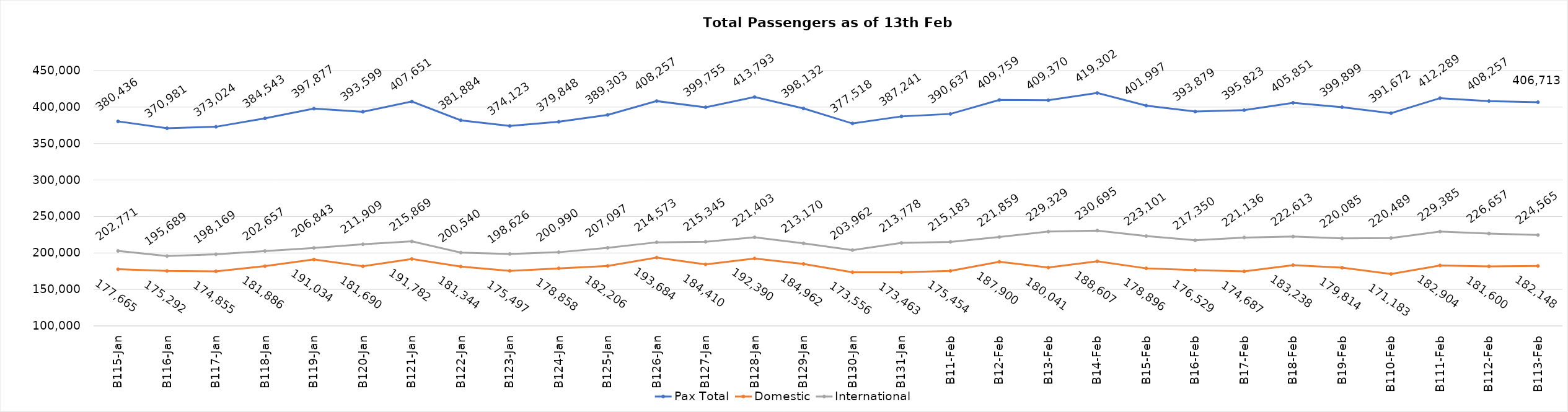
| Category | Pax Total | Domestic | International |
|---|---|---|---|
| 2024-01-15 | 380436 | 177665 | 202771 |
| 2024-01-16 | 370981 | 175292 | 195689 |
| 2024-01-17 | 373024 | 174855 | 198169 |
| 2024-01-18 | 384543 | 181886 | 202657 |
| 2024-01-19 | 397877 | 191034 | 206843 |
| 2024-01-20 | 393599 | 181690 | 211909 |
| 2024-01-21 | 407651 | 191782 | 215869 |
| 2024-01-22 | 381884 | 181344 | 200540 |
| 2024-01-23 | 374123 | 175497 | 198626 |
| 2024-01-24 | 379848 | 178858 | 200990 |
| 2024-01-25 | 389303 | 182206 | 207097 |
| 2024-01-26 | 408257 | 193684 | 214573 |
| 2024-01-27 | 399755 | 184410 | 215345 |
| 2024-01-28 | 413793 | 192390 | 221403 |
| 2024-01-29 | 398132 | 184962 | 213170 |
| 2024-01-30 | 377518 | 173556 | 203962 |
| 2024-01-31 | 387241 | 173463 | 213778 |
| 2024-02-01 | 390637 | 175454 | 215183 |
| 2024-02-02 | 409759 | 187900 | 221859 |
| 2024-02-03 | 409370 | 180041 | 229329 |
| 2024-02-04 | 419302 | 188607 | 230695 |
| 2024-02-05 | 401997 | 178896 | 223101 |
| 2024-02-06 | 393879 | 176529 | 217350 |
| 2024-02-07 | 395823 | 174687 | 221136 |
| 2024-02-08 | 405851 | 183238 | 222613 |
| 2024-02-09 | 399899 | 179814 | 220085 |
| 2024-02-10 | 391672 | 171183 | 220489 |
| 2024-02-11 | 412289 | 182904 | 229385 |
| 2024-02-12 | 408257 | 181600 | 226657 |
| 2024-02-13 | 406713 | 182148 | 224565 |